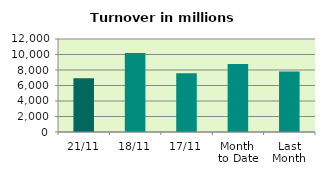
| Category | Series 0 |
|---|---|
| 21/11 | 6949.068 |
| 18/11 | 10202.819 |
| 17/11 | 7582.555 |
| Month 
to Date | 8762.771 |
| Last
Month | 7813.06 |